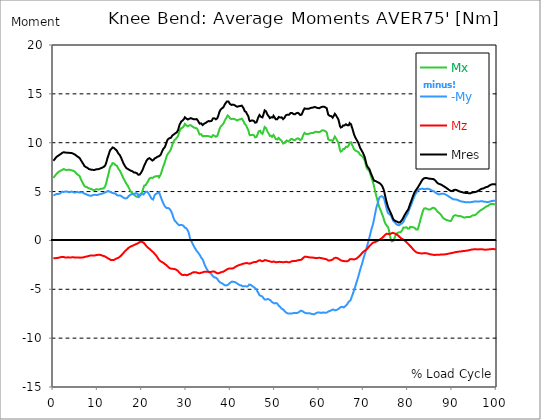
| Category |  Mx |  -My |  Mz |  Mres |
|---|---|---|---|---|
| 0.0 | 6.39 | 4.613 | -1.82 | 8.149 |
| 0.167348456675344 | 6.494 | 4.637 | -1.814 | 8.24 |
| 0.334696913350688 | 6.597 | 4.662 | -1.814 | 8.331 |
| 0.5020453700260321 | 6.694 | 4.698 | -1.807 | 8.429 |
| 0.669393826701376 | 6.792 | 4.747 | -1.807 | 8.532 |
| 0.83674228337672 | 6.877 | 4.741 | -1.795 | 8.587 |
| 1.0040907400520642 | 6.944 | 4.741 | -1.783 | 8.642 |
| 1.1621420602454444 | 7.005 | 4.753 | -1.771 | 8.69 |
| 1.3294905169207885 | 7.053 | 4.783 | -1.753 | 8.739 |
| 1.4968389735961325 | 7.096 | 4.826 | -1.734 | 8.794 |
| 1.6641874302714765 | 7.145 | 4.856 | -1.71 | 8.849 |
| 1.8315358869468206 | 7.169 | 4.929 | -1.704 | 8.903 |
| 1.9988843436221646 | 7.206 | 4.99 | -1.692 | 8.958 |
| 2.1662328002975086 | 7.26 | 4.984 | -1.686 | 9.001 |
| 2.333581256972853 | 7.315 | 4.954 | -1.692 | 9.025 |
| 2.5009297136481967 | 7.303 | 4.954 | -1.722 | 9.019 |
| 2.6682781703235405 | 7.23 | 4.996 | -1.747 | 8.995 |
| 2.8356266269988843 | 7.199 | 5.015 | -1.753 | 8.983 |
| 3.002975083674229 | 7.199 | 5.015 | -1.747 | 8.983 |
| 3.1703235403495724 | 7.218 | 5.002 | -1.728 | 8.983 |
| 3.337671997024917 | 7.236 | 4.948 | -1.728 | 8.97 |
| 3.4957233172182973 | 7.254 | 4.911 | -1.734 | 8.964 |
| 3.663071773893641 | 7.236 | 4.923 | -1.747 | 8.958 |
| 3.8304202305689854 | 7.199 | 4.972 | -1.747 | 8.952 |
| 3.997768687244329 | 7.187 | 5.002 | -1.741 | 8.958 |
| 4.165117143919673 | 7.175 | 5.002 | -1.728 | 8.946 |
| 4.332465600595017 | 7.151 | 4.972 | -1.716 | 8.91 |
| 4.499814057270361 | 7.151 | 4.923 | -1.722 | 8.885 |
| 4.667162513945706 | 7.096 | 4.905 | -1.734 | 8.837 |
| 4.834510970621049 | 7.035 | 4.899 | -1.741 | 8.788 |
| 5.001859427296393 | 6.968 | 4.911 | -1.759 | 8.745 |
| 5.169207883971737 | 6.859 | 4.954 | -1.753 | 8.678 |
| 5.336556340647081 | 6.761 | 4.972 | -1.753 | 8.611 |
| 5.503904797322425 | 6.719 | 4.954 | -1.741 | 8.569 |
| 5.671253253997769 | 6.688 | 4.917 | -1.747 | 8.526 |
| 5.82930457419115 | 6.633 | 4.893 | -1.753 | 8.477 |
| 5.996653030866494 | 6.5 | 4.911 | -1.765 | 8.386 |
| 6.164001487541838 | 6.287 | 4.929 | -1.765 | 8.234 |
| 6.331349944217181 | 6.141 | 4.929 | -1.753 | 8.124 |
| 6.498698400892526 | 6.007 | 4.905 | -1.747 | 8.009 |
| 6.66604685756787 | 5.83 | 4.893 | -1.741 | 7.875 |
| 6.833395314243213 | 5.702 | 4.875 | -1.728 | 7.765 |
| 7.000743770918558 | 5.568 | 4.789 | -1.698 | 7.613 |
| 7.168092227593902 | 5.532 | 4.759 | -1.68 | 7.565 |
| 7.335440684269246 | 5.471 | 4.741 | -1.661 | 7.504 |
| 7.50278914094459 | 5.435 | 4.716 | -1.649 | 7.467 |
| 7.6701375976199335 | 5.435 | 4.668 | -1.631 | 7.431 |
| 7.837486054295278 | 5.386 | 4.637 | -1.613 | 7.37 |
| 7.995537374488658 | 5.325 | 4.613 | -1.588 | 7.309 |
| 8.162885831164003 | 5.307 | 4.589 | -1.564 | 7.279 |
| 8.330234287839346 | 5.289 | 4.576 | -1.546 | 7.26 |
| 8.49758274451469 | 5.264 | 4.576 | -1.534 | 7.248 |
| 8.664931201190035 | 5.24 | 4.589 | -1.54 | 7.236 |
| 8.832279657865378 | 5.197 | 4.613 | -1.552 | 7.224 |
| 8.999628114540721 | 5.155 | 4.65 | -1.552 | 7.218 |
| 9.166976571216066 | 5.149 | 4.662 | -1.546 | 7.212 |
| 9.334325027891412 | 5.149 | 4.674 | -1.54 | 7.218 |
| 9.501673484566755 | 5.185 | 4.674 | -1.521 | 7.242 |
| 9.669021941242098 | 5.246 | 4.65 | -1.503 | 7.279 |
| 9.836370397917442 | 5.246 | 4.643 | -1.491 | 7.279 |
| 10.003718854592787 | 5.222 | 4.662 | -1.479 | 7.279 |
| 10.17106731126813 | 5.216 | 4.692 | -1.473 | 7.291 |
| 10.329118631461512 | 5.222 | 4.716 | -1.473 | 7.321 |
| 10.496467088136853 | 5.27 | 4.735 | -1.467 | 7.358 |
| 10.663815544812199 | 5.282 | 4.741 | -1.485 | 7.382 |
| 10.831164001487544 | 5.276 | 4.753 | -1.515 | 7.4 |
| 10.998512458162887 | 5.295 | 4.789 | -1.546 | 7.443 |
| 11.16586091483823 | 5.325 | 4.82 | -1.564 | 7.485 |
| 11.333209371513574 | 5.337 | 4.844 | -1.594 | 7.516 |
| 11.50055782818892 | 5.374 | 4.887 | -1.619 | 7.571 |
| 11.667906284864264 | 5.495 | 4.905 | -1.643 | 7.656 |
| 11.835254741539607 | 5.733 | 4.917 | -1.686 | 7.826 |
| 12.00260319821495 | 6.013 | 4.966 | -1.741 | 8.064 |
| 12.169951654890292 | 6.341 | 5.033 | -1.801 | 8.362 |
| 12.337300111565641 | 6.609 | 5.069 | -1.844 | 8.587 |
| 12.504648568240984 | 6.913 | 5.057 | -1.874 | 8.812 |
| 12.662699888434362 | 7.279 | 5.002 | -1.917 | 9.068 |
| 12.830048345109708 | 7.54 | 4.936 | -1.966 | 9.244 |
| 12.997396801785053 | 7.601 | 4.929 | -2.014 | 9.293 |
| 13.164745258460396 | 7.735 | 4.911 | -2.02 | 9.403 |
| 13.33209371513574 | 7.911 | 4.856 | -2.014 | 9.518 |
| 13.499442171811083 | 7.954 | 4.808 | -2.014 | 9.524 |
| 13.666790628486426 | 7.869 | 4.82 | -1.996 | 9.463 |
| 13.834139085161771 | 7.79 | 4.832 | -1.954 | 9.403 |
| 14.001487541837117 | 7.717 | 4.802 | -1.899 | 9.323 |
| 14.16883599851246 | 7.662 | 4.735 | -1.862 | 9.244 |
| 14.336184455187803 | 7.632 | 4.637 | -1.838 | 9.171 |
| 14.503532911863147 | 7.479 | 4.589 | -1.814 | 9.019 |
| 14.670881368538492 | 7.339 | 4.589 | -1.777 | 8.897 |
| 14.828932688731873 | 7.236 | 4.601 | -1.722 | 8.806 |
| 14.996281145407215 | 7.133 | 4.613 | -1.667 | 8.721 |
| 15.163629602082558 | 7.066 | 4.613 | -1.594 | 8.648 |
| 15.330978058757903 | 6.84 | 4.534 | -1.528 | 8.411 |
| 15.498326515433247 | 6.664 | 4.479 | -1.442 | 8.222 |
| 15.665674972108594 | 6.494 | 4.418 | -1.357 | 8.045 |
| 15.833023428783937 | 6.335 | 4.37 | -1.272 | 7.869 |
| 16.00037188545928 | 6.195 | 4.333 | -1.187 | 7.735 |
| 16.167720342134626 | 6.055 | 4.303 | -1.108 | 7.601 |
| 16.335068798809967 | 5.921 | 4.29 | -1.028 | 7.485 |
| 16.502417255485312 | 5.781 | 4.297 | -0.955 | 7.382 |
| 16.669765712160658 | 5.678 | 4.357 | -0.889 | 7.339 |
| 16.837114168836 | 5.556 | 4.443 | -0.815 | 7.309 |
| 17.004462625511344 | 5.41 | 4.534 | -0.742 | 7.266 |
| 17.16251394570472 | 5.258 | 4.589 | -0.669 | 7.206 |
| 17.32986240238007 | 5.106 | 4.662 | -0.645 | 7.163 |
| 17.497210859055414 | 5.009 | 4.698 | -0.615 | 7.139 |
| 17.664559315730756 | 4.911 | 4.741 | -0.578 | 7.108 |
| 17.8319077724061 | 4.826 | 4.765 | -0.548 | 7.072 |
| 17.999256229081443 | 4.741 | 4.747 | -0.517 | 7.011 |
| 18.166604685756788 | 4.668 | 4.735 | -0.487 | 6.956 |
| 18.333953142432133 | 4.619 | 4.771 | -0.444 | 6.938 |
| 18.501301599107478 | 4.576 | 4.832 | -0.402 | 6.944 |
| 18.668650055782823 | 4.503 | 4.856 | -0.365 | 6.913 |
| 18.835998512458165 | 4.455 | 4.856 | -0.335 | 6.877 |
| 19.00334696913351 | 4.449 | 4.759 | -0.316 | 6.804 |
| 19.170695425808855 | 4.503 | 4.619 | -0.268 | 6.719 |
| 19.338043882484197 | 4.692 | 4.467 | -0.213 | 6.7 |
| 19.496095202677576 | 4.65 | 4.558 | -0.158 | 6.749 |
| 19.66344365935292 | 4.698 | 4.656 | -0.128 | 6.853 |
| 19.830792116028263 | 4.777 | 4.729 | -0.116 | 6.968 |
| 19.998140572703612 | 4.917 | 4.765 | -0.14 | 7.108 |
| 20.165489029378953 | 5.149 | 4.716 | -0.183 | 7.266 |
| 20.3328374860543 | 5.398 | 4.698 | -0.225 | 7.461 |
| 20.500185942729644 | 5.617 | 4.692 | -0.286 | 7.668 |
| 20.667534399404985 | 5.605 | 4.887 | -0.383 | 7.814 |
| 20.83488285608033 | 5.654 | 4.99 | -0.487 | 7.978 |
| 21.002231312755672 | 5.806 | 4.972 | -0.584 | 8.149 |
| 21.16957976943102 | 5.879 | 4.984 | -0.669 | 8.24 |
| 21.336928226106362 | 6.025 | 4.929 | -0.736 | 8.344 |
| 21.504276682781704 | 6.195 | 4.802 | -0.797 | 8.404 |
| 21.67162513945705 | 6.335 | 4.662 | -0.858 | 8.423 |
| 21.82967645965043 | 6.408 | 4.534 | -0.925 | 8.398 |
| 21.997024916325774 | 6.408 | 4.376 | -0.998 | 8.307 |
| 22.16437337300112 | 6.408 | 4.272 | -1.071 | 8.24 |
| 22.33172182967646 | 6.396 | 4.187 | -1.132 | 8.173 |
| 22.499070286351806 | 6.408 | 4.187 | -1.193 | 8.167 |
| 22.666418743027148 | 6.481 | 4.394 | -1.278 | 8.277 |
| 22.833767199702496 | 6.548 | 4.631 | -1.363 | 8.392 |
| 23.00111565637784 | 6.56 | 4.723 | -1.442 | 8.435 |
| 23.168464113053183 | 6.56 | 4.771 | -1.528 | 8.459 |
| 23.335812569728528 | 6.573 | 4.808 | -1.637 | 8.508 |
| 23.50316102640387 | 6.591 | 4.838 | -1.753 | 8.569 |
| 23.670509483079215 | 6.591 | 4.881 | -1.868 | 8.624 |
| 23.83785793975456 | 6.451 | 4.936 | -1.984 | 8.617 |
| 23.995909259947936 | 6.585 | 4.747 | -2.063 | 8.678 |
| 24.163257716623285 | 6.713 | 4.528 | -2.124 | 8.745 |
| 24.330606173298627 | 6.907 | 4.327 | -2.167 | 8.897 |
| 24.49795462997397 | 7.163 | 4.126 | -2.203 | 9.08 |
| 24.665303086649313 | 7.4 | 3.944 | -2.246 | 9.244 |
| 24.83265154332466 | 7.625 | 3.767 | -2.3 | 9.384 |
| 25.0 | 7.814 | 3.603 | -2.373 | 9.421 |
| 25.167348456675345 | 8.033 | 3.481 | -2.422 | 9.561 |
| 25.334696913350694 | 8.277 | 3.39 | -2.477 | 9.768 |
| 25.502045370026035 | 8.544 | 3.329 | -2.532 | 10.011 |
| 25.669393826701377 | 8.751 | 3.298 | -2.605 | 10.212 |
| 25.836742283376722 | 8.861 | 3.329 | -2.684 | 10.34 |
| 26.004090740052067 | 8.958 | 3.353 | -2.757 | 10.437 |
| 26.17143919672741 | 9.062 | 3.256 | -2.818 | 10.461 |
| 26.329490516920792 | 9.177 | 3.165 | -2.854 | 10.486 |
| 26.49683897359613 | 9.305 | 3.049 | -2.879 | 10.504 |
| 26.66418743027148 | 9.536 | 2.885 | -2.891 | 10.601 |
| 26.831535886946828 | 9.792 | 2.708 | -2.903 | 10.729 |
| 26.998884343622166 | 9.975 | 2.44 | -2.903 | 10.772 |
| 27.166232800297514 | 10.127 | 2.246 | -2.915 | 10.839 |
| 27.333581256972852 | 10.273 | 2.051 | -2.921 | 10.906 |
| 27.5009297136482 | 10.352 | 1.954 | -2.952 | 10.96 |
| 27.668278170323543 | 10.407 | 1.893 | -2.988 | 11.009 |
| 27.835626626998888 | 10.449 | 1.838 | -3.031 | 11.058 |
| 28.002975083674233 | 10.595 | 1.704 | -3.061 | 11.186 |
| 28.170323540349575 | 10.723 | 1.613 | -3.146 | 11.326 |
| 28.33767199702492 | 11.015 | 1.552 | -3.256 | 11.63 |
| 28.50502045370026 | 11.222 | 1.582 | -3.347 | 11.867 |
| 28.663071773893645 | 11.356 | 1.588 | -3.396 | 12.013 |
| 28.830420230568986 | 11.484 | 1.582 | -3.463 | 12.165 |
| 28.99776868724433 | 11.545 | 1.576 | -3.518 | 12.251 |
| 29.165117143919673 | 11.551 | 1.558 | -3.542 | 12.275 |
| 29.33246560059502 | 11.618 | 1.503 | -3.542 | 12.342 |
| 29.499814057270367 | 11.739 | 1.412 | -3.524 | 12.445 |
| 29.66716251394571 | 11.928 | 1.315 | -3.511 | 12.604 |
| 29.834510970621054 | 11.867 | 1.29 | -3.536 | 12.549 |
| 30.00185942729639 | 11.782 | 1.241 | -3.56 | 12.47 |
| 30.169207883971744 | 11.709 | 1.181 | -3.572 | 12.403 |
| 30.33655634064708 | 11.685 | 1.004 | -3.53 | 12.372 |
| 30.50390479732243 | 11.739 | 0.815 | -3.487 | 12.409 |
| 30.671253253997772 | 11.776 | 0.542 | -3.451 | 12.451 |
| 30.829304574191156 | 11.764 | 0.225 | -3.414 | 12.464 |
| 30.996653030866494 | 11.782 | 0.012 | -3.402 | 12.518 |
| 31.164001487541842 | 11.733 | -0.116 | -3.353 | 12.488 |
| 31.331349944217187 | 11.672 | -0.262 | -3.298 | 12.451 |
| 31.498698400892525 | 11.618 | -0.414 | -3.256 | 12.421 |
| 31.666046857567874 | 11.563 | -0.578 | -3.256 | 12.403 |
| 31.833395314243212 | 11.484 | -0.706 | -3.25 | 12.348 |
| 32.00074377091856 | 11.52 | -0.779 | -3.25 | 12.391 |
| 32.1680922275939 | 11.551 | -0.943 | -3.25 | 12.451 |
| 32.33544068426925 | 11.472 | -1.077 | -3.28 | 12.421 |
| 32.50278914094459 | 11.368 | -1.162 | -3.305 | 12.342 |
| 32.670137597619934 | 11.204 | -1.248 | -3.329 | 12.214 |
| 32.83748605429528 | 11.009 | -1.345 | -3.347 | 12.074 |
| 33.004834510970625 | 10.839 | -1.473 | -3.365 | 11.952 |
| 33.162885831164004 | 10.845 | -1.601 | -3.335 | 11.946 |
| 33.33023428783935 | 10.875 | -1.747 | -3.305 | 11.983 |
| 33.497582744514695 | 10.796 | -1.826 | -3.286 | 11.916 |
| 33.664931201190036 | 10.656 | -1.935 | -3.268 | 11.806 |
| 33.83227965786538 | 10.644 | -2.112 | -3.244 | 11.837 |
| 33.99962811454073 | 10.687 | -2.337 | -3.213 | 11.946 |
| 34.16697657121607 | 10.662 | -2.52 | -3.213 | 11.952 |
| 34.33432502789141 | 10.674 | -2.69 | -3.201 | 12.013 |
| 34.50167348456676 | 10.687 | -2.836 | -3.195 | 12.08 |
| 34.6690219412421 | 10.687 | -2.97 | -3.207 | 12.129 |
| 34.83637039791744 | 10.681 | -3.104 | -3.213 | 12.172 |
| 35.00371885459279 | 10.674 | -3.201 | -3.219 | 12.214 |
| 35.17106731126814 | 10.656 | -3.244 | -3.232 | 12.226 |
| 35.338415767943474 | 10.62 | -3.305 | -3.244 | 12.202 |
| 35.49646708813686 | 10.583 | -3.384 | -3.238 | 12.19 |
| 35.6638155448122 | 10.571 | -3.469 | -3.213 | 12.22 |
| 35.831164001487544 | 10.644 | -3.56 | -3.195 | 12.33 |
| 35.998512458162885 | 10.772 | -3.67 | -3.171 | 12.488 |
| 36.165860914838234 | 10.802 | -3.731 | -3.152 | 12.549 |
| 36.333209371513576 | 10.717 | -3.791 | -3.189 | 12.494 |
| 36.50055782818892 | 10.668 | -3.804 | -3.225 | 12.445 |
| 36.667906284864266 | 10.607 | -3.804 | -3.28 | 12.391 |
| 36.83525474153961 | 10.589 | -3.889 | -3.353 | 12.397 |
| 37.002603198214956 | 10.711 | -3.95 | -3.372 | 12.512 |
| 37.1699516548903 | 10.942 | -4.071 | -3.353 | 12.725 |
| 37.337300111565646 | 11.167 | -4.175 | -3.347 | 12.951 |
| 37.50464856824098 | 11.423 | -4.242 | -3.317 | 13.194 |
| 37.66269988843437 | 11.587 | -4.309 | -3.286 | 13.346 |
| 37.83004834510971 | 11.703 | -4.351 | -3.256 | 13.443 |
| 37.99739680178505 | 11.794 | -4.376 | -3.232 | 13.51 |
| 38.16474525846039 | 11.837 | -4.394 | -3.207 | 13.529 |
| 38.33209371513574 | 11.928 | -4.479 | -3.201 | 13.614 |
| 38.49944217181109 | 12.074 | -4.54 | -3.171 | 13.748 |
| 38.666790628486424 | 12.269 | -4.589 | -3.11 | 13.918 |
| 38.83413908516178 | 12.397 | -4.607 | -3.055 | 14.034 |
| 39.001487541837115 | 12.494 | -4.607 | -3.012 | 14.107 |
| 39.16883599851246 | 12.658 | -4.595 | -2.964 | 14.229 |
| 39.336184455187805 | 12.786 | -4.552 | -2.921 | 14.308 |
| 39.503532911863154 | 12.731 | -4.497 | -2.897 | 14.222 |
| 39.670881368538495 | 12.646 | -4.424 | -2.879 | 14.125 |
| 39.83822982521384 | 12.5 | -4.339 | -2.879 | 13.967 |
| 39.996281145407224 | 12.451 | -4.284 | -2.885 | 13.912 |
| 40.163629602082565 | 12.415 | -4.236 | -2.885 | 13.869 |
| 40.33097805875791 | 12.391 | -4.211 | -2.879 | 13.839 |
| 40.498326515433256 | 12.451 | -4.242 | -2.854 | 13.9 |
| 40.6656749721086 | 12.451 | -4.242 | -2.83 | 13.894 |
| 40.83302342878393 | 12.433 | -4.248 | -2.781 | 13.857 |
| 41.00037188545929 | 12.378 | -4.272 | -2.72 | 13.79 |
| 41.16772034213463 | 12.342 | -4.309 | -2.696 | 13.754 |
| 41.33506879880997 | 12.305 | -4.357 | -2.641 | 13.717 |
| 41.50241725548531 | 12.275 | -4.412 | -2.605 | 13.681 |
| 41.66976571216066 | 12.281 | -4.467 | -2.568 | 13.681 |
| 41.837114168836 | 12.366 | -4.497 | -2.52 | 13.736 |
| 42.004462625511344 | 12.366 | -4.57 | -2.501 | 13.742 |
| 42.17181108218669 | 12.391 | -4.595 | -2.477 | 13.754 |
| 42.32986240238007 | 12.433 | -4.595 | -2.465 | 13.772 |
| 42.497210859055414 | 12.458 | -4.68 | -2.434 | 13.796 |
| 42.66455931573076 | 12.397 | -4.692 | -2.404 | 13.729 |
| 42.831907772406105 | 12.251 | -4.692 | -2.386 | 13.577 |
| 42.999256229081446 | 12.105 | -4.692 | -2.361 | 13.431 |
| 43.16660468575679 | 11.91 | -4.637 | -2.355 | 13.224 |
| 43.33395314243214 | 11.831 | -4.68 | -2.331 | 13.164 |
| 43.50130159910748 | 11.77 | -4.747 | -2.307 | 13.127 |
| 43.66865005578282 | 11.569 | -4.723 | -2.313 | 12.951 |
| 43.83599851245817 | 11.508 | -4.716 | -2.325 | 12.908 |
| 44.00334696913351 | 11.277 | -4.631 | -2.355 | 12.689 |
| 44.17069542580886 | 10.918 | -4.522 | -2.38 | 12.342 |
| 44.3380438824842 | 10.766 | -4.491 | -2.38 | 12.208 |
| 44.49609520267758 | 10.778 | -4.54 | -2.343 | 12.226 |
| 44.66344365935292 | 10.79 | -4.619 | -2.313 | 12.263 |
| 44.83079211602827 | 10.827 | -4.662 | -2.276 | 12.293 |
| 44.99814057270361 | 10.814 | -4.704 | -2.252 | 12.275 |
| 45.16548902937895 | 10.875 | -4.759 | -2.209 | 12.33 |
| 45.332837486054295 | 10.723 | -4.802 | -2.209 | 12.19 |
| 45.500185942729644 | 10.547 | -4.881 | -2.221 | 12.05 |
| 45.66753439940499 | 10.522 | -4.936 | -2.221 | 12.032 |
| 45.83488285608033 | 10.595 | -5.009 | -2.197 | 12.092 |
| 46.00223131275568 | 10.766 | -5.197 | -2.148 | 12.293 |
| 46.16957976943102 | 10.997 | -5.325 | -2.094 | 12.525 |
| 46.336928226106366 | 11.167 | -5.459 | -2.057 | 12.701 |
| 46.50427668278171 | 11.265 | -5.605 | -2.027 | 12.835 |
| 46.671625139457056 | 11.222 | -5.69 | -2.027 | 12.829 |
| 46.829676459650436 | 11.021 | -5.678 | -2.075 | 12.652 |
| 46.99702491632577 | 10.924 | -5.69 | -2.13 | 12.579 |
| 47.16437337300112 | 10.906 | -5.751 | -2.148 | 12.591 |
| 47.33172182967646 | 11.1 | -5.867 | -2.112 | 12.798 |
| 47.49907028635181 | 11.356 | -5.964 | -2.063 | 13.06 |
| 47.66641874302716 | 11.606 | -6.049 | -2.014 | 13.31 |
| 47.83376719970249 | 11.618 | -6.068 | -2.014 | 13.322 |
| 48.001115656377834 | 11.49 | -6.049 | -2.027 | 13.2 |
| 48.16846411305319 | 11.277 | -6.007 | -2.057 | 12.993 |
| 48.33581256972853 | 11.107 | -5.994 | -2.087 | 12.847 |
| 48.50316102640387 | 11.125 | -6.037 | -2.069 | 12.871 |
| 48.67050948307921 | 10.875 | -6.037 | -2.118 | 12.658 |
| 48.837857939754564 | 10.699 | -6.055 | -2.154 | 12.518 |
| 49.005206396429905 | 10.699 | -6.134 | -2.167 | 12.543 |
| 49.163257716623285 | 10.705 | -6.244 | -2.185 | 12.604 |
| 49.33060617329863 | 10.601 | -6.299 | -2.203 | 12.543 |
| 49.49795462997397 | 10.626 | -6.36 | -2.197 | 12.585 |
| 49.66530308664932 | 10.796 | -6.42 | -2.154 | 12.756 |
| 49.832651543324666 | 10.711 | -6.451 | -2.167 | 12.695 |
| 50.0 | 10.51 | -6.427 | -2.203 | 12.518 |
| 50.16734845667534 | 10.376 | -6.408 | -2.221 | 12.397 |
| 50.33469691335069 | 10.297 | -6.396 | -2.24 | 12.33 |
| 50.50204537002604 | 10.334 | -6.457 | -2.227 | 12.391 |
| 50.66939382670139 | 10.419 | -6.567 | -2.203 | 12.518 |
| 50.836742283376715 | 10.486 | -6.67 | -2.179 | 12.634 |
| 51.00409074005207 | 10.394 | -6.743 | -2.191 | 12.598 |
| 51.17143919672741 | 10.315 | -6.81 | -2.209 | 12.573 |
| 51.32949051692079 | 10.261 | -6.901 | -2.209 | 12.591 |
| 51.496838973596134 | 10.194 | -6.986 | -2.209 | 12.598 |
| 51.66418743027148 | 10.054 | -7.029 | -2.221 | 12.506 |
| 51.831535886946824 | 9.908 | -7.066 | -2.233 | 12.409 |
| 51.99888434362217 | 9.895 | -7.126 | -2.227 | 12.433 |
| 52.16623280029752 | 9.987 | -7.224 | -2.215 | 12.567 |
| 52.33358125697285 | 10.102 | -7.321 | -2.197 | 12.719 |
| 52.5009297136482 | 10.188 | -7.376 | -2.191 | 12.823 |
| 52.668278170323546 | 10.23 | -7.431 | -2.191 | 12.89 |
| 52.835626626998895 | 10.175 | -7.461 | -2.215 | 12.865 |
| 53.00297508367424 | 10.121 | -7.467 | -2.246 | 12.829 |
| 53.17032354034958 | 10.139 | -7.479 | -2.246 | 12.859 |
| 53.33767199702492 | 10.236 | -7.473 | -2.227 | 12.932 |
| 53.50502045370027 | 10.352 | -7.492 | -2.185 | 13.036 |
| 53.663071773893655 | 10.419 | -7.492 | -2.148 | 13.084 |
| 53.83042023056899 | 10.388 | -7.479 | -2.118 | 13.048 |
| 53.99776868724433 | 10.334 | -7.455 | -2.118 | 12.993 |
| 54.16511714391967 | 10.279 | -7.431 | -2.118 | 12.932 |
| 54.33246560059503 | 10.248 | -7.412 | -2.118 | 12.902 |
| 54.49981405727037 | 10.261 | -7.412 | -2.112 | 12.908 |
| 54.667162513945705 | 10.267 | -7.412 | -2.112 | 12.914 |
| 54.834510970621054 | 10.388 | -7.431 | -2.075 | 13.024 |
| 55.0018594272964 | 10.431 | -7.443 | -2.051 | 13.066 |
| 55.169207883971744 | 10.449 | -7.406 | -2.033 | 13.06 |
| 55.336556340647086 | 10.455 | -7.358 | -2.014 | 13.042 |
| 55.50390479732243 | 10.376 | -7.297 | -2.008 | 12.944 |
| 55.671253253997776 | 10.273 | -7.236 | -2.008 | 12.835 |
| 55.83860171067312 | 10.255 | -7.187 | -1.996 | 12.792 |
| 55.9966530308665 | 10.346 | -7.187 | -1.954 | 12.871 |
| 56.16400148754184 | 10.534 | -7.23 | -1.881 | 13.042 |
| 56.33134994421718 | 10.729 | -7.291 | -1.807 | 13.237 |
| 56.498698400892536 | 10.875 | -7.339 | -1.734 | 13.377 |
| 56.66604685756788 | 11.009 | -7.382 | -1.661 | 13.51 |
| 56.83339531424321 | 10.954 | -7.419 | -1.661 | 13.492 |
| 57.00074377091856 | 10.894 | -7.455 | -1.667 | 13.474 |
| 57.16809222759391 | 10.875 | -7.461 | -1.68 | 13.468 |
| 57.33544068426925 | 10.881 | -7.461 | -1.698 | 13.468 |
| 57.5027891409446 | 10.894 | -7.455 | -1.716 | 13.474 |
| 57.670137597619934 | 10.912 | -7.455 | -1.728 | 13.486 |
| 57.83748605429528 | 10.936 | -7.455 | -1.734 | 13.498 |
| 58.004834510970625 | 10.973 | -7.485 | -1.741 | 13.547 |
| 58.16288583116401 | 10.997 | -7.51 | -1.741 | 13.577 |
| 58.330234287839346 | 10.997 | -7.528 | -1.734 | 13.583 |
| 58.497582744514695 | 10.997 | -7.54 | -1.753 | 13.596 |
| 58.66493120119004 | 10.997 | -7.552 | -1.771 | 13.608 |
| 58.832279657865385 | 11.052 | -7.559 | -1.777 | 13.644 |
| 58.999628114540734 | 11.107 | -7.522 | -1.789 | 13.663 |
| 59.16697657121607 | 11.137 | -7.473 | -1.801 | 13.65 |
| 59.33432502789142 | 11.113 | -7.412 | -1.814 | 13.596 |
| 59.50167348456676 | 11.107 | -7.388 | -1.801 | 13.571 |
| 59.66902194124211 | 11.1 | -7.358 | -1.789 | 13.547 |
| 59.83637039791745 | 11.088 | -7.364 | -1.783 | 13.541 |
| 60.00371885459278 | 11.076 | -7.37 | -1.777 | 13.535 |
| 60.17106731126813 | 11.082 | -7.382 | -1.777 | 13.547 |
| 60.33841576794349 | 11.161 | -7.406 | -1.795 | 13.62 |
| 60.49646708813685 | 11.24 | -7.431 | -1.807 | 13.693 |
| 60.6638155448122 | 11.271 | -7.376 | -1.832 | 13.687 |
| 60.831164001487544 | 11.265 | -7.364 | -1.862 | 13.675 |
| 60.99851245816289 | 11.253 | -7.4 | -1.868 | 13.687 |
| 61.16586091483824 | 11.222 | -7.406 | -1.881 | 13.663 |
| 61.333209371513576 | 11.186 | -7.394 | -1.899 | 13.626 |
| 61.50055782818892 | 11.204 | -7.406 | -1.905 | 13.65 |
| 61.667906284864266 | 11.058 | -7.406 | -1.935 | 13.529 |
| 61.835254741539615 | 10.711 | -7.346 | -1.99 | 13.206 |
| 62.002603198214956 | 10.37 | -7.272 | -2.045 | 12.884 |
| 62.16995165489029 | 10.273 | -7.242 | -2.051 | 12.786 |
| 62.33730011156564 | 10.248 | -7.224 | -2.045 | 12.75 |
| 62.504648568240995 | 10.261 | -7.206 | -2.027 | 12.738 |
| 62.67199702491633 | 10.267 | -7.169 | -2.014 | 12.719 |
| 62.83004834510971 | 10.212 | -7.108 | -1.99 | 12.634 |
| 62.99739680178505 | 10.157 | -7.059 | -1.96 | 12.561 |
| 63.1647452584604 | 10.218 | -7.066 | -1.911 | 12.598 |
| 63.33209371513575 | 10.468 | -7.126 | -1.82 | 12.817 |
| 63.4994421718111 | 10.626 | -7.157 | -1.771 | 12.957 |
| 63.666790628486424 | 10.559 | -7.139 | -1.771 | 12.896 |
| 63.83413908516177 | 10.388 | -7.12 | -1.783 | 12.756 |
| 64.00148754183712 | 10.23 | -7.096 | -1.795 | 12.61 |
| 64.16883599851248 | 10.108 | -7.066 | -1.832 | 12.506 |
| 64.3361844551878 | 9.92 | -7.023 | -1.881 | 12.336 |
| 64.50353291186315 | 9.597 | -6.938 | -1.935 | 12.025 |
| 64.6708813685385 | 9.232 | -6.859 | -1.984 | 11.691 |
| 64.83822982521384 | 9.092 | -6.822 | -2.014 | 11.557 |
| 65.00557828188919 | 9.141 | -6.81 | -2.063 | 11.599 |
| 65.16362960208257 | 9.183 | -6.786 | -2.1 | 11.624 |
| 65.3309780587579 | 9.342 | -6.822 | -2.094 | 11.764 |
| 65.49832651543326 | 9.403 | -6.865 | -2.087 | 11.837 |
| 65.6656749721086 | 9.36 | -6.798 | -2.118 | 11.77 |
| 65.83302342878395 | 9.451 | -6.737 | -2.118 | 11.806 |
| 66.00037188545929 | 9.585 | -6.694 | -2.124 | 11.892 |
| 66.16772034213463 | 9.597 | -6.609 | -2.118 | 11.861 |
| 66.33506879880998 | 9.567 | -6.494 | -2.124 | 11.776 |
| 66.50241725548531 | 9.616 | -6.36 | -2.1 | 11.746 |
| 66.66976571216065 | 9.749 | -6.256 | -2.045 | 11.794 |
| 66.83711416883601 | 10.023 | -6.256 | -1.935 | 12.007 |
| 67.00446262551135 | 10.108 | -6.147 | -1.905 | 12.025 |
| 67.1718110821867 | 10.035 | -5.976 | -1.911 | 11.879 |
| 67.32986240238007 | 9.835 | -5.733 | -1.929 | 11.599 |
| 67.49721085905541 | 9.689 | -5.55 | -1.923 | 11.38 |
| 67.66455931573076 | 9.506 | -5.325 | -1.935 | 11.113 |
| 67.83190777240611 | 9.323 | -5.1 | -1.947 | 10.851 |
| 67.99925622908145 | 9.226 | -4.863 | -1.935 | 10.65 |
| 68.16660468575678 | 9.19 | -4.625 | -1.905 | 10.51 |
| 68.33395314243214 | 9.153 | -4.382 | -1.874 | 10.364 |
| 68.50130159910749 | 9.11 | -4.138 | -1.82 | 10.218 |
| 68.66865005578282 | 9.098 | -3.889 | -1.747 | 10.115 |
| 68.83599851245816 | 9.037 | -3.633 | -1.68 | 9.956 |
| 69.00334696913352 | 8.903 | -3.359 | -1.613 | 9.737 |
| 69.17069542580886 | 8.782 | -3.079 | -1.546 | 9.524 |
| 69.3380438824842 | 8.703 | -2.818 | -1.467 | 9.36 |
| 69.50539233915956 | 8.672 | -2.58 | -1.363 | 9.244 |
| 69.66344365935292 | 8.648 | -2.349 | -1.266 | 9.153 |
| 69.83079211602826 | 8.514 | -2.063 | -1.199 | 8.964 |
| 69.99814057270362 | 8.386 | -1.789 | -1.138 | 8.788 |
| 70.16548902937896 | 8.264 | -1.54 | -1.077 | 8.624 |
| 70.33283748605429 | 8.045 | -1.296 | -1.016 | 8.362 |
| 70.50018594272964 | 7.741 | -1.053 | -0.98 | 8.039 |
| 70.667534399405 | 7.467 | -0.755 | -0.931 | 7.741 |
| 70.83488285608033 | 7.309 | -0.475 | -0.852 | 7.565 |
| 71.00223131275568 | 7.242 | -0.213 | -0.749 | 7.473 |
| 71.16957976943102 | 7.169 | 0.061 | -0.645 | 7.382 |
| 71.33692822610637 | 7.035 | 0.359 | -0.56 | 7.242 |
| 71.50427668278171 | 6.81 | 0.669 | -0.487 | 7.035 |
| 71.67162513945706 | 6.554 | 0.98 | -0.414 | 6.81 |
| 71.8389735961324 | 6.329 | 1.254 | -0.341 | 6.658 |
| 71.99702491632577 | 6.098 | 1.497 | -0.262 | 6.475 |
| 72.16437337300113 | 5.848 | 1.777 | -0.207 | 6.299 |
| 72.33172182967647 | 5.55 | 2.142 | -0.201 | 6.116 |
| 72.49907028635181 | 5.222 | 2.538 | -0.183 | 6.068 |
| 72.66641874302715 | 4.899 | 2.927 | -0.152 | 6.08 |
| 72.8337671997025 | 4.583 | 3.292 | -0.116 | 6.074 |
| 73.00111565637783 | 4.303 | 3.554 | -0.079 | 6.001 |
| 73.16846411305319 | 4.011 | 3.822 | -0.037 | 5.958 |
| 73.33581256972853 | 3.718 | 4.09 | 0.006 | 5.915 |
| 73.50316102640387 | 3.445 | 4.333 | 0.049 | 5.879 |
| 73.67050948307921 | 3.256 | 4.443 | 0.103 | 5.842 |
| 73.83785793975457 | 3.085 | 4.503 | 0.152 | 5.781 |
| 74.00520639642991 | 2.891 | 4.528 | 0.201 | 5.69 |
| 74.16325771662328 | 2.684 | 4.546 | 0.256 | 5.575 |
| 74.33060617329863 | 2.495 | 4.467 | 0.323 | 5.41 |
| 74.49795462997398 | 2.276 | 4.388 | 0.396 | 5.222 |
| 74.66530308664932 | 1.99 | 4.199 | 0.481 | 4.948 |
| 74.83265154332466 | 1.789 | 3.901 | 0.566 | 4.607 |
| 75.00000000000001 | 1.649 | 3.585 | 0.639 | 4.266 |
| 75.16734845667534 | 1.54 | 3.286 | 0.676 | 3.95 |
| 75.3346969133507 | 1.479 | 3.006 | 0.676 | 3.67 |
| 75.50204537002605 | 1.363 | 2.793 | 0.669 | 3.42 |
| 75.66939382670138 | 1.12 | 2.739 | 0.645 | 3.238 |
| 75.83674228337672 | 0.718 | 2.696 | 0.651 | 3.073 |
| 76.00409074005208 | 0.347 | 2.647 | 0.669 | 2.921 |
| 76.17143919672742 | 0.037 | 2.538 | 0.7 | 2.745 |
| 76.33878765340276 | -0.097 | 2.386 | 0.742 | 2.574 |
| 76.49683897359614 | -0.128 | 2.179 | 0.779 | 2.373 |
| 76.66418743027148 | -0.055 | 2.008 | 0.773 | 2.191 |
| 76.83153588694682 | 0.079 | 1.929 | 0.742 | 2.087 |
| 76.99888434362218 | 0.286 | 1.874 | 0.7 | 2.039 |
| 77.16623280029752 | 0.493 | 1.777 | 0.676 | 1.99 |
| 77.33358125697285 | 0.645 | 1.674 | 0.651 | 1.941 |
| 77.5009297136482 | 0.73 | 1.637 | 0.596 | 1.929 |
| 77.66827817032356 | 0.779 | 1.582 | 0.542 | 1.887 |
| 77.83562662699889 | 0.809 | 1.552 | 0.481 | 1.844 |
| 78.00297508367423 | 0.834 | 1.552 | 0.408 | 1.832 |
| 78.17032354034959 | 0.846 | 1.582 | 0.329 | 1.85 |
| 78.33767199702493 | 0.828 | 1.667 | 0.25 | 1.911 |
| 78.50502045370027 | 0.864 | 1.765 | 0.201 | 2.002 |
| 78.67236891037561 | 1.035 | 1.753 | 0.17 | 2.069 |
| 78.83042023056899 | 1.181 | 1.832 | 0.122 | 2.221 |
| 78.99776868724433 | 1.327 | 1.917 | 0.067 | 2.373 |
| 79.16511714391969 | 1.321 | 2.112 | 0.012 | 2.526 |
| 79.33246560059503 | 1.302 | 2.294 | -0.043 | 2.666 |
| 79.49981405727036 | 1.284 | 2.428 | -0.116 | 2.781 |
| 79.66716251394571 | 1.345 | 2.532 | -0.189 | 2.909 |
| 79.83451097062107 | 1.29 | 2.659 | -0.268 | 3.025 |
| 80.00185942729641 | 1.205 | 2.806 | -0.347 | 3.128 |
| 80.16920788397174 | 1.168 | 3.019 | -0.42 | 3.305 |
| 80.33655634064709 | 1.217 | 3.238 | -0.493 | 3.53 |
| 80.50390479732243 | 1.388 | 3.396 | -0.578 | 3.761 |
| 80.67125325399778 | 1.406 | 3.572 | -0.657 | 3.95 |
| 80.83860171067312 | 1.363 | 3.767 | -0.73 | 4.144 |
| 80.99665303086651 | 1.333 | 3.998 | -0.815 | 4.37 |
| 81.16400148754184 | 1.351 | 4.205 | -0.913 | 4.576 |
| 81.3313499442172 | 1.333 | 4.382 | -0.992 | 4.765 |
| 81.49869840089255 | 1.284 | 4.558 | -1.071 | 4.923 |
| 81.66604685756786 | 1.211 | 4.716 | -1.15 | 5.063 |
| 81.83339531424322 | 1.12 | 4.844 | -1.199 | 5.167 |
| 82.00074377091858 | 1.035 | 4.966 | -1.248 | 5.258 |
| 82.16809222759392 | 1.114 | 5.076 | -1.266 | 5.38 |
| 82.33544068426926 | 1.315 | 5.167 | -1.272 | 5.508 |
| 82.50278914094459 | 1.57 | 5.216 | -1.29 | 5.629 |
| 82.67013759761994 | 1.862 | 5.252 | -1.302 | 5.757 |
| 82.83748605429528 | 2.154 | 5.27 | -1.321 | 5.885 |
| 83.00483451097062 | 2.428 | 5.289 | -1.333 | 6.025 |
| 83.17218296764597 | 2.702 | 5.295 | -1.333 | 6.147 |
| 83.33023428783935 | 2.952 | 5.289 | -1.327 | 6.25 |
| 83.4975827445147 | 3.159 | 5.264 | -1.308 | 6.323 |
| 83.66493120119004 | 3.274 | 5.246 | -1.302 | 6.366 |
| 83.83227965786537 | 3.292 | 5.24 | -1.296 | 6.366 |
| 83.99962811454073 | 3.292 | 5.276 | -1.302 | 6.39 |
| 84.16697657121607 | 3.232 | 5.289 | -1.321 | 6.378 |
| 84.33432502789142 | 3.207 | 5.295 | -1.327 | 6.372 |
| 84.50167348456677 | 3.183 | 5.289 | -1.345 | 6.36 |
| 84.6690219412421 | 3.171 | 5.264 | -1.363 | 6.335 |
| 84.83637039791745 | 3.152 | 5.24 | -1.394 | 6.317 |
| 85.0037188545928 | 3.159 | 5.209 | -1.418 | 6.305 |
| 85.17106731126813 | 3.195 | 5.173 | -1.436 | 6.299 |
| 85.33841576794349 | 3.268 | 5.124 | -1.442 | 6.299 |
| 85.50576422461883 | 3.323 | 5.082 | -1.454 | 6.299 |
| 85.66381554481221 | 3.347 | 5.051 | -1.467 | 6.293 |
| 85.83116400148755 | 3.341 | 5.027 | -1.479 | 6.274 |
| 85.99851245816289 | 3.298 | 4.972 | -1.479 | 6.201 |
| 86.16586091483823 | 3.232 | 4.905 | -1.479 | 6.116 |
| 86.33320937151358 | 3.146 | 4.863 | -1.485 | 6.043 |
| 86.50055782818893 | 3.043 | 4.814 | -1.473 | 5.958 |
| 86.66790628486427 | 2.939 | 4.759 | -1.467 | 5.867 |
| 86.83525474153961 | 2.848 | 4.716 | -1.454 | 5.794 |
| 87.00260319821496 | 2.818 | 4.723 | -1.454 | 5.781 |
| 87.16995165489031 | 2.769 | 4.735 | -1.454 | 5.769 |
| 87.33730011156564 | 2.684 | 4.753 | -1.448 | 5.739 |
| 87.504648568241 | 2.574 | 4.771 | -1.448 | 5.696 |
| 87.67199702491634 | 2.465 | 4.783 | -1.442 | 5.66 |
| 87.83004834510972 | 2.367 | 4.783 | -1.442 | 5.611 |
| 87.99739680178506 | 2.264 | 4.783 | -1.436 | 5.562 |
| 88.1647452584604 | 2.221 | 4.759 | -1.43 | 5.514 |
| 88.33209371513574 | 2.185 | 4.729 | -1.424 | 5.471 |
| 88.49944217181108 | 2.124 | 4.698 | -1.418 | 5.422 |
| 88.66679062848644 | 2.087 | 4.656 | -1.406 | 5.368 |
| 88.83413908516178 | 2.063 | 4.607 | -1.388 | 5.307 |
| 89.00148754183712 | 2.051 | 4.558 | -1.375 | 5.258 |
| 89.16883599851246 | 2.039 | 4.51 | -1.351 | 5.203 |
| 89.33618445518782 | 2.002 | 4.461 | -1.339 | 5.149 |
| 89.50353291186315 | 1.966 | 4.412 | -1.327 | 5.094 |
| 89.6708813685385 | 1.99 | 4.357 | -1.308 | 5.057 |
| 89.83822982521386 | 2.094 | 4.321 | -1.29 | 5.057 |
| 90.00557828188919 | 2.246 | 4.266 | -1.284 | 5.076 |
| 90.16362960208257 | 2.416 | 4.211 | -1.266 | 5.118 |
| 90.3309780587579 | 2.52 | 4.199 | -1.241 | 5.155 |
| 90.49832651543326 | 2.586 | 4.199 | -1.217 | 5.185 |
| 90.66567497210859 | 2.586 | 4.199 | -1.205 | 5.191 |
| 90.83302342878395 | 2.58 | 4.193 | -1.187 | 5.179 |
| 91.00037188545929 | 2.544 | 4.181 | -1.181 | 5.155 |
| 91.16772034213463 | 2.507 | 4.15 | -1.168 | 5.112 |
| 91.33506879880998 | 2.513 | 4.108 | -1.15 | 5.076 |
| 91.50241725548533 | 2.52 | 4.071 | -1.144 | 5.045 |
| 91.66976571216065 | 2.501 | 4.041 | -1.138 | 5.009 |
| 91.83711416883601 | 2.471 | 4.011 | -1.132 | 4.978 |
| 92.00446262551137 | 2.459 | 3.992 | -1.12 | 4.96 |
| 92.1718110821867 | 2.446 | 3.98 | -1.108 | 4.948 |
| 92.33915953886203 | 2.404 | 3.974 | -1.102 | 4.923 |
| 92.49721085905541 | 2.367 | 3.956 | -1.089 | 4.899 |
| 92.66455931573077 | 2.331 | 3.944 | -1.077 | 4.881 |
| 92.83190777240611 | 2.337 | 3.931 | -1.071 | 4.869 |
| 92.99925622908145 | 2.367 | 3.901 | -1.059 | 4.856 |
| 93.1666046857568 | 2.386 | 3.895 | -1.053 | 4.856 |
| 93.33395314243214 | 2.398 | 3.901 | -1.041 | 4.856 |
| 93.50130159910749 | 2.404 | 3.901 | -1.022 | 4.844 |
| 93.66865005578283 | 2.398 | 3.901 | -1.004 | 4.832 |
| 93.83599851245818 | 2.386 | 3.901 | -0.992 | 4.82 |
| 94.00334696913353 | 2.386 | 3.907 | -0.974 | 4.814 |
| 94.17069542580886 | 2.44 | 3.913 | -0.955 | 4.844 |
| 94.3380438824842 | 2.495 | 3.925 | -0.937 | 4.875 |
| 94.50539233915954 | 2.538 | 3.937 | -0.925 | 4.899 |
| 94.66344365935292 | 2.568 | 3.956 | -0.913 | 4.923 |
| 94.83079211602828 | 2.568 | 3.974 | -0.913 | 4.929 |
| 94.99814057270362 | 2.568 | 3.992 | -0.913 | 4.936 |
| 95.16548902937897 | 2.593 | 3.998 | -0.913 | 4.948 |
| 95.33283748605432 | 2.653 | 3.992 | -0.913 | 4.972 |
| 95.50018594272963 | 2.726 | 3.986 | -0.913 | 5.002 |
| 95.66753439940499 | 2.793 | 3.98 | -0.919 | 5.033 |
| 95.83488285608034 | 2.866 | 3.98 | -0.919 | 5.076 |
| 96.00223131275567 | 2.939 | 3.986 | -0.913 | 5.124 |
| 96.16957976943102 | 3.012 | 3.992 | -0.907 | 5.167 |
| 96.33692822610638 | 3.079 | 4.004 | -0.907 | 5.216 |
| 96.50427668278171 | 3.122 | 4.017 | -0.907 | 5.258 |
| 96.67162513945706 | 3.159 | 4.029 | -0.907 | 5.295 |
| 96.8389735961324 | 3.201 | 4.004 | -0.913 | 5.301 |
| 96.99702491632577 | 3.244 | 3.974 | -0.919 | 5.313 |
| 97.16437337300111 | 3.305 | 3.968 | -0.937 | 5.355 |
| 97.33172182967647 | 3.365 | 3.956 | -0.955 | 5.392 |
| 97.49907028635181 | 3.42 | 3.95 | -0.949 | 5.429 |
| 97.66641874302715 | 3.475 | 3.944 | -0.943 | 5.465 |
| 97.8337671997025 | 3.493 | 3.937 | -0.937 | 5.477 |
| 98.00111565637785 | 3.524 | 3.937 | -0.937 | 5.495 |
| 98.16846411305319 | 3.585 | 3.944 | -0.919 | 5.55 |
| 98.33581256972855 | 3.639 | 3.962 | -0.907 | 5.605 |
| 98.50316102640389 | 3.7 | 3.974 | -0.901 | 5.66 |
| 98.67050948307921 | 3.724 | 3.998 | -0.895 | 5.696 |
| 98.83785793975456 | 3.731 | 4.029 | -0.889 | 5.727 |
| 99.0052063964299 | 3.737 | 4.047 | -0.882 | 5.739 |
| 99.17255485310525 | 3.737 | 4.047 | -0.882 | 5.739 |
| 99.33060617329863 | 3.712 | 4.059 | -0.889 | 5.745 |
| 99.49795462997399 | 3.694 | 4.065 | -0.895 | 5.745 |
| 99.66530308664933 | 3.688 | 4.059 | -0.901 | 5.739 |
| 99.83265154332467 | 3.639 | 4.059 | -0.907 | 5.721 |
| 100.0 | 3.597 | 4.059 | -0.913 | 5.702 |